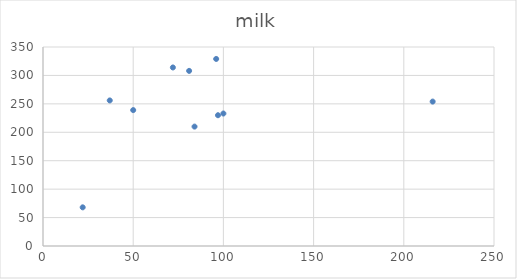
| Category | milk |
|---|---|
| 216.0 | 254 |
| 100.0 | 233 |
| 81.0 | 308 |
| 37.0 | 256 |
| 97.0 | 230 |
| 96.0 | 329 |
| 84.0 | 210 |
| 72.0 | 314 |
| 50.0 | 239 |
| 22.0 | 68 |